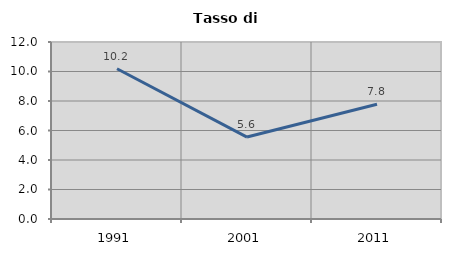
| Category | Tasso di disoccupazione   |
|---|---|
| 1991.0 | 10.188 |
| 2001.0 | 5.554 |
| 2011.0 | 7.778 |